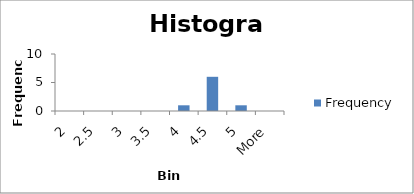
| Category | Frequency |
|---|---|
| 2 | 0 |
| 2.5 | 0 |
| 3 | 0 |
| 3.5 | 0 |
| 4 | 1 |
| 4.5 | 6 |
| 5 | 1 |
| More | 0 |